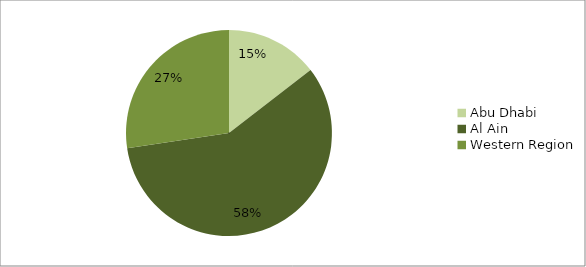
| Category | Abu Dhabi Al Ain Western Region |
|---|---|
| Abu Dhabi | 33708 |
| Al Ain | 134734 |
| Western Region | 63477 |